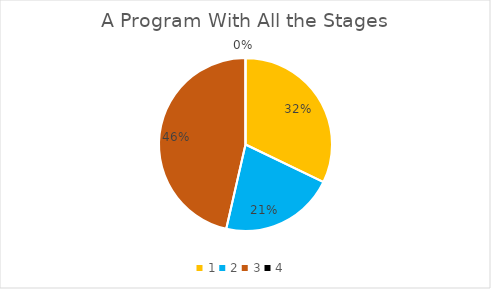
| Category | Series 0 |
|---|---|
| 0 | 0.321 |
| 1 | 0.214 |
| 2 | 0.464 |
| 3 | 0 |